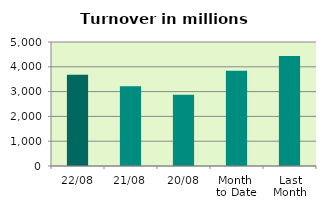
| Category | Series 0 |
|---|---|
| 22/08 | 3677.222 |
| 21/08 | 3215.827 |
| 20/08 | 2876.192 |
| Month 
to Date | 3843.965 |
| Last
Month | 4433.065 |